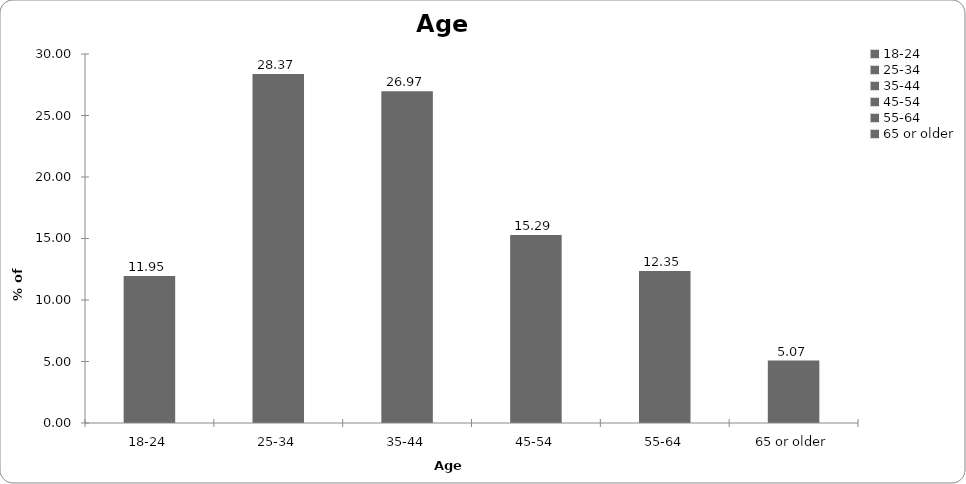
| Category | Age range |
|---|---|
| 18-24 | 11.949 |
| 25-34 | 28.371 |
| 35-44 | 26.969 |
| 45-54 | 15.287 |
| 55-64 | 12.35 |
| 65 or older | 5.073 |